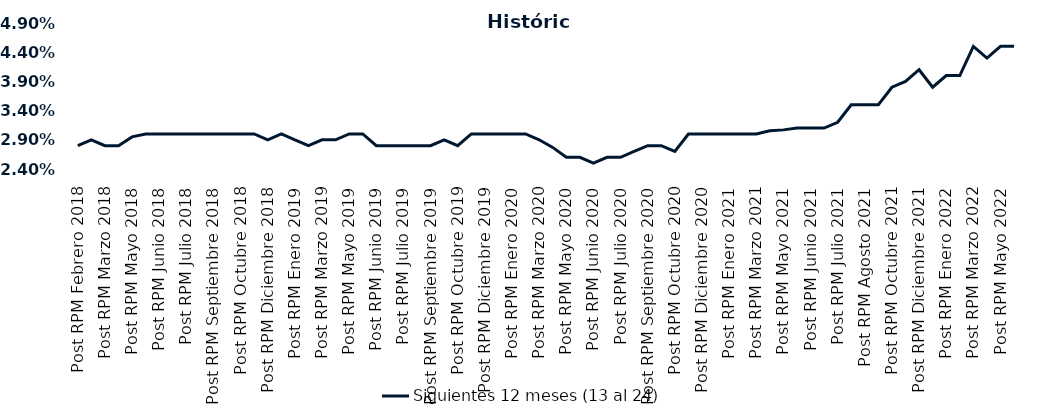
| Category | Siguientes 12 meses (13 al 24)  |
|---|---|
| Post RPM Febrero 2018 | 0.028 |
| Pre RPM Marzo 2018 | 0.029 |
| Post RPM Marzo 2018 | 0.028 |
| Pre RPM Mayo 2018 | 0.028 |
| Post RPM Mayo 2018 | 0.03 |
| Pre RPM Junio 2018 | 0.03 |
| Post RPM Junio 2018 | 0.03 |
| Pre RPM Julio 2018 | 0.03 |
| Post RPM Julio 2018 | 0.03 |
| Pre RPM Septiembre 2018 | 0.03 |
| Post RPM Septiembre 2018 | 0.03 |
| Pre RPM Octubre 2018 | 0.03 |
| Post RPM Octubre 2018 | 0.03 |
| Pre RPM Diciembre 2018 | 0.03 |
| Post RPM Diciembre 2018 | 0.029 |
| Pre RPM Enero 2019 | 0.03 |
| Post RPM Enero 2019 | 0.029 |
| Pre RPM Marzo 2019 | 0.028 |
| Post RPM Marzo 2019 | 0.029 |
| Pre RPM Mayo 2019 | 0.029 |
| Post RPM Mayo 2019 | 0.03 |
| Pre RPM Junio 2019 | 0.03 |
| Post RPM Junio 2019 | 0.028 |
| Pre RPM Julio 2019 | 0.028 |
| Post RPM Julio 2019 | 0.028 |
| Pre RPM Septiembre 2019 | 0.028 |
| Post RPM Septiembre 2019 | 0.028 |
| Pre RPM Octubre 2019 | 0.029 |
| Post RPM Octubre 2019 | 0.028 |
| Pre RPM Diciembre 2019 | 0.03 |
| Post RPM Diciembre 2019 | 0.03 |
| Pre RPM Enero 2020 | 0.03 |
| Post RPM Enero 2020 | 0.03 |
| Pre RPM Marzo 2020 | 0.03 |
| Post RPM Marzo 2020 | 0.029 |
| Pre RPM Mayo 2020 | 0.028 |
| Post RPM Mayo 2020 | 0.026 |
| Pre RPM Junio 2020 | 0.026 |
| Post RPM Junio 2020 | 0.025 |
| Pre RPM Julio 2020 | 0.026 |
| Post RPM Julio 2020 | 0.026 |
| Pre RPM Septiembre 2020 | 0.027 |
| Post RPM Septiembre 2020 | 0.028 |
| Pre RPM Octubre 2020 | 0.028 |
| Post RPM Octubre 2020 | 0.027 |
| Pre RPM Diciembre 2020 | 0.03 |
| Post RPM Diciembre 2020 | 0.03 |
| Pre RPM Enero 2021 | 0.03 |
| Post RPM Enero 2021 | 0.03 |
| Pre RPM Marzo 2021 | 0.03 |
| Post RPM Marzo 2021 | 0.03 |
| Pre RPM Mayo 2021 | 0.031 |
| Post RPM Mayo 2021 | 0.031 |
| Pre RPM Junio 2021 | 0.031 |
| Post RPM Junio 2021 | 0.031 |
| Pre RPM Julio 2021 | 0.031 |
| Post RPM Julio 2021 | 0.032 |
| Pre RPM Agosto 2021 | 0.035 |
| Post RPM Agosto 2021 | 0.035 |
| Pre RPM Octubre 2021 | 0.035 |
| Post RPM Octubre 2021 | 0.038 |
| Pre RPM Diciembre 2021 | 0.039 |
| Post RPM Diciembre 2021 | 0.041 |
| Pre RPM Enero 2022 | 0.038 |
| Post RPM Enero 2022 | 0.04 |
| Pre RPM Marzo 2022 | 0.04 |
| Post RPM Marzo 2022 | 0.045 |
| Pre RPM Mayo 2022 | 0.043 |
| Post RPM Mayo 2022 | 0.045 |
| Pre RPM Junio 2022 | 0.045 |